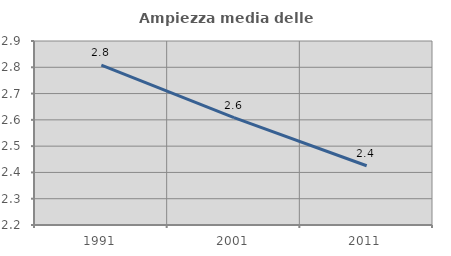
| Category | Ampiezza media delle famiglie |
|---|---|
| 1991.0 | 2.808 |
| 2001.0 | 2.609 |
| 2011.0 | 2.425 |